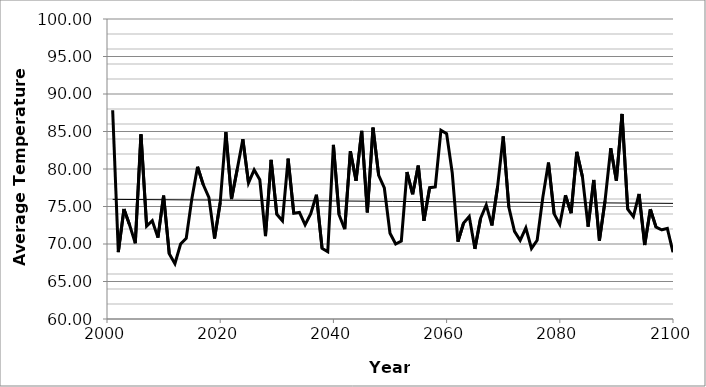
| Category | Committed |
|---|---|
| 2001.0 | 87.831 |
| 2002.0 | 68.92 |
| 2003.0 | 74.658 |
| 2004.0 | 72.522 |
| 2005.0 | 70.099 |
| 2006.0 | 84.618 |
| 2007.0 | 72.385 |
| 2008.0 | 73.098 |
| 2009.0 | 70.848 |
| 2010.0 | 76.451 |
| 2011.0 | 68.688 |
| 2012.0 | 67.368 |
| 2013.0 | 69.991 |
| 2014.0 | 70.759 |
| 2015.0 | 76.082 |
| 2016.0 | 80.296 |
| 2017.0 | 77.922 |
| 2018.0 | 76.213 |
| 2019.0 | 70.727 |
| 2020.0 | 75.522 |
| 2021.0 | 84.922 |
| 2022.0 | 75.988 |
| 2023.0 | 79.934 |
| 2024.0 | 83.979 |
| 2025.0 | 78.157 |
| 2026.0 | 79.896 |
| 2027.0 | 78.57 |
| 2028.0 | 71.053 |
| 2029.0 | 81.212 |
| 2030.0 | 73.953 |
| 2031.0 | 73.092 |
| 2032.0 | 81.383 |
| 2033.0 | 74.095 |
| 2034.0 | 74.203 |
| 2035.0 | 72.552 |
| 2036.0 | 74.037 |
| 2037.0 | 76.566 |
| 2038.0 | 69.415 |
| 2039.0 | 68.972 |
| 2040.0 | 83.208 |
| 2041.0 | 73.904 |
| 2042.0 | 71.971 |
| 2043.0 | 82.369 |
| 2044.0 | 78.427 |
| 2045.0 | 85.08 |
| 2046.0 | 74.214 |
| 2047.0 | 85.509 |
| 2048.0 | 79.146 |
| 2049.0 | 77.466 |
| 2050.0 | 71.427 |
| 2051.0 | 69.991 |
| 2052.0 | 70.392 |
| 2053.0 | 79.599 |
| 2054.0 | 76.635 |
| 2055.0 | 80.456 |
| 2056.0 | 73.103 |
| 2057.0 | 77.508 |
| 2058.0 | 77.603 |
| 2059.0 | 85.158 |
| 2060.0 | 84.713 |
| 2061.0 | 79.466 |
| 2062.0 | 70.304 |
| 2063.0 | 72.79 |
| 2064.0 | 73.666 |
| 2065.0 | 69.35 |
| 2066.0 | 73.409 |
| 2067.0 | 75.204 |
| 2068.0 | 72.471 |
| 2069.0 | 77.594 |
| 2070.0 | 84.34 |
| 2071.0 | 74.896 |
| 2072.0 | 71.692 |
| 2073.0 | 70.491 |
| 2074.0 | 72.162 |
| 2075.0 | 69.406 |
| 2076.0 | 70.495 |
| 2077.0 | 76.221 |
| 2078.0 | 80.859 |
| 2079.0 | 74.014 |
| 2080.0 | 72.608 |
| 2081.0 | 76.494 |
| 2082.0 | 74.102 |
| 2083.0 | 82.292 |
| 2084.0 | 78.955 |
| 2085.0 | 72.313 |
| 2086.0 | 78.532 |
| 2087.0 | 70.455 |
| 2088.0 | 75.807 |
| 2089.0 | 82.765 |
| 2090.0 | 78.44 |
| 2091.0 | 87.334 |
| 2092.0 | 74.635 |
| 2093.0 | 73.639 |
| 2094.0 | 76.669 |
| 2095.0 | 69.863 |
| 2096.0 | 74.642 |
| 2097.0 | 72.253 |
| 2098.0 | 71.888 |
| 2099.0 | 72.077 |
| 2100.0 | 68.895 |